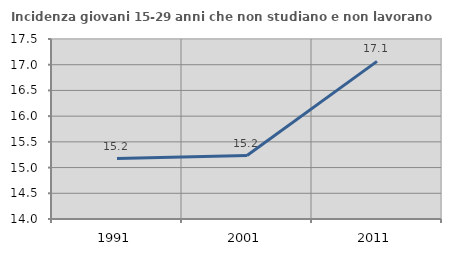
| Category | Incidenza giovani 15-29 anni che non studiano e non lavorano  |
|---|---|
| 1991.0 | 15.175 |
| 2001.0 | 15.233 |
| 2011.0 | 17.065 |